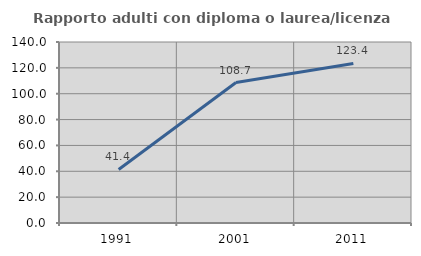
| Category | Rapporto adulti con diploma o laurea/licenza media  |
|---|---|
| 1991.0 | 41.401 |
| 2001.0 | 108.654 |
| 2011.0 | 123.431 |